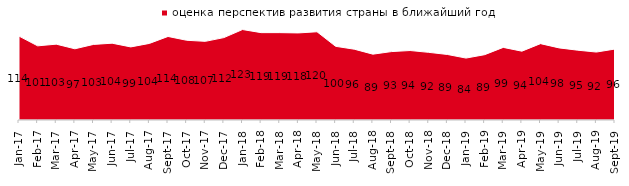
| Category | оценка перспектив развития страны в ближайший год |
|---|---|
| 2017-01-01 | 114 |
| 2017-02-01 | 100.75 |
| 2017-03-01 | 103.05 |
| 2017-04-01 | 96.75 |
| 2017-05-01 | 102.7 |
| 2017-06-01 | 104.35 |
| 2017-07-01 | 99.3 |
| 2017-08-01 | 104.05 |
| 2017-09-01 | 113.5 |
| 2017-10-01 | 108.35 |
| 2017-11-01 | 106.85 |
| 2017-12-01 | 111.95 |
| 2018-01-01 | 122.9 |
| 2018-02-01 | 118.7 |
| 2018-03-01 | 118.7 |
| 2018-04-01 | 118.3 |
| 2018-05-01 | 119.9 |
| 2018-06-01 | 100.1 |
| 2018-07-01 | 96.2 |
| 2018-08-01 | 89.45 |
| 2018-09-01 | 92.95 |
| 2018-10-01 | 94.4 |
| 2018-11-01 | 91.916 |
| 2018-12-01 | 89.05 |
| 2019-01-01 | 84.15 |
| 2019-02-01 | 88.75 |
| 2019-03-01 | 98.657 |
| 2019-04-01 | 93.515 |
| 2019-05-01 | 103.764 |
| 2019-06-01 | 97.955 |
| 2019-07-01 | 94.851 |
| 2019-08-01 | 92.308 |
| 2019-09-01 | 96.436 |